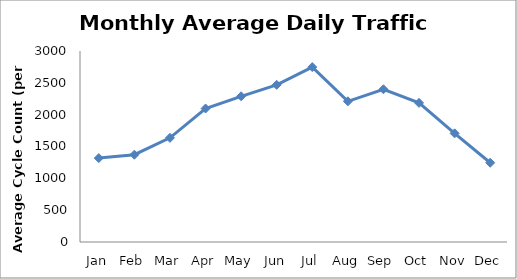
| Category | Series 0 |
|---|---|
| Jan | 1318 |
| Feb | 1371 |
| Mar | 1636 |
| Apr | 2096.75 |
| May | 2288.5 |
| Jun | 2468.25 |
| Jul | 2747.5 |
| Aug | 2210 |
| Sep | 2398.75 |
| Oct | 2185.5 |
| Nov | 1706.25 |
| Dec | 1244.5 |